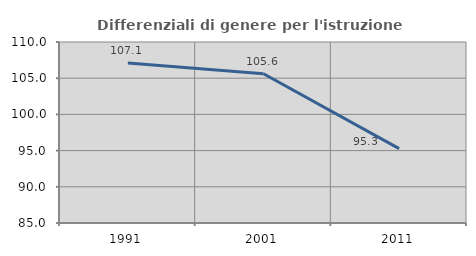
| Category | Differenziali di genere per l'istruzione superiore |
|---|---|
| 1991.0 | 107.094 |
| 2001.0 | 105.611 |
| 2011.0 | 95.273 |